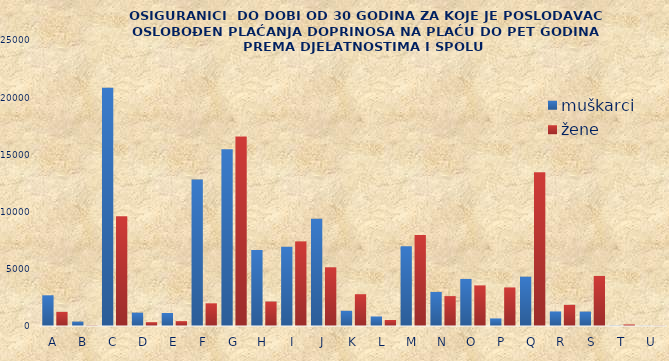
| Category | muškarci | žene |
|---|---|---|
| A | 2684 | 1236 |
| B | 384 | 37 |
| C | 20822 | 9602 |
| D | 1167 | 334 |
| E | 1138 | 426 |
| F | 12800 | 1983 |
| G | 15451 | 16575 |
| H | 6646 | 2139 |
| I | 6927 | 7396 |
| J | 9385 | 5133 |
| K | 1330 | 2780 |
| L | 834 | 524 |
| M | 6972 | 7957 |
| N | 2978 | 2614 |
| O | 4114 | 3549 |
| P | 662 | 3372 |
| Q | 4311 | 13442 |
| R | 1271 | 1847 |
| S | 1258 | 4376 |
| T | 27 | 135 |
| U | 15 | 20 |